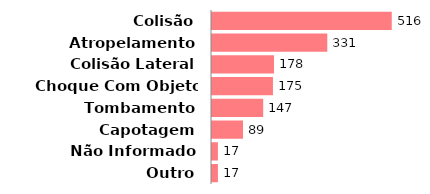
| Category | Qtde |
|---|---|
| Colisão | 516 |
| Atropelamento | 331 |
| Colisão Lateral | 178 |
| Choque Com Objeto Fixo | 175 |
| Tombamento | 147 |
| Capotagem | 89 |
| Não Informado | 17 |
| Outro | 17 |